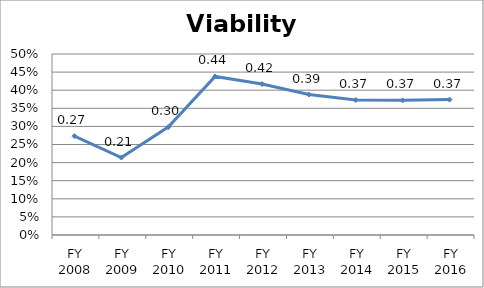
| Category | Viability ratio |
|---|---|
| FY 2016 | 0.374 |
| FY 2015 | 0.372 |
| FY 2014 | 0.373 |
| FY 2013 | 0.388 |
| FY 2012 | 0.417 |
| FY 2011 | 0.438 |
| FY 2010 | 0.298 |
| FY 2009 | 0.214 |
| FY 2008 | 0.273 |